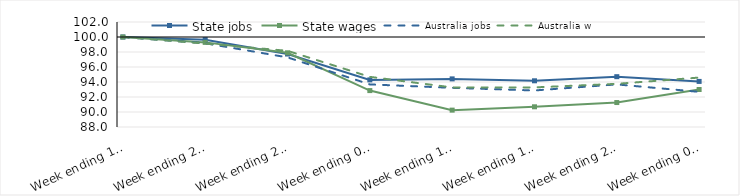
| Category | State jobs | State wages | Australia jobs | Australia wages |
|---|---|---|---|---|
| 2020-03-14 | 100 | 100 | 100 | 100 |
| 2020-03-21 | 99.643 | 99.283 | 99.165 | 99.123 |
| 2020-03-28 | 97.731 | 97.892 | 97.282 | 98.156 |
| 2020-04-04 | 94.283 | 92.854 | 93.679 | 94.686 |
| 2020-04-11 | 94.416 | 90.249 | 93.222 | 93.277 |
| 2020-04-18 | 94.161 | 90.694 | 92.871 | 93.281 |
| 2020-04-25 | 94.709 | 91.262 | 93.679 | 93.754 |
| 2020-05-02 | 94.078 | 92.998 | 92.686 | 94.591 |